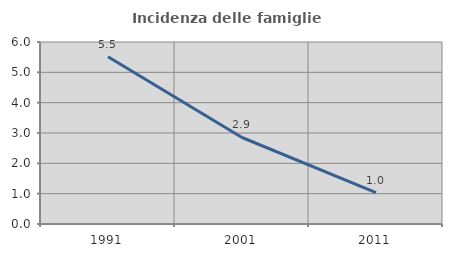
| Category | Incidenza delle famiglie numerose |
|---|---|
| 1991.0 | 5.516 |
| 2001.0 | 2.852 |
| 2011.0 | 1.034 |